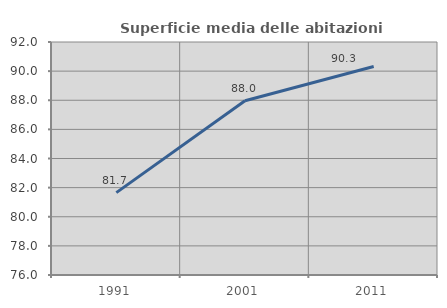
| Category | Superficie media delle abitazioni occupate |
|---|---|
| 1991.0 | 81.657 |
| 2001.0 | 87.967 |
| 2011.0 | 90.314 |